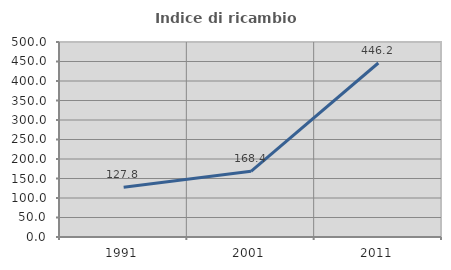
| Category | Indice di ricambio occupazionale  |
|---|---|
| 1991.0 | 127.848 |
| 2001.0 | 168.421 |
| 2011.0 | 446.154 |